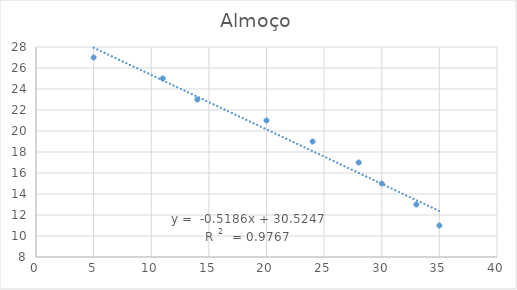
| Category | Almoço |
|---|---|
| 35.0 | 11 |
| 33.0 | 13 |
| 30.0 | 15 |
| 28.0 | 17 |
| 24.0 | 19 |
| 20.0 | 21 |
| 14.0 | 23 |
| 11.0 | 25 |
| 5.0 | 27 |